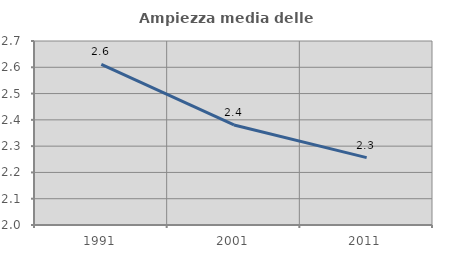
| Category | Ampiezza media delle famiglie |
|---|---|
| 1991.0 | 2.611 |
| 2001.0 | 2.381 |
| 2011.0 | 2.256 |